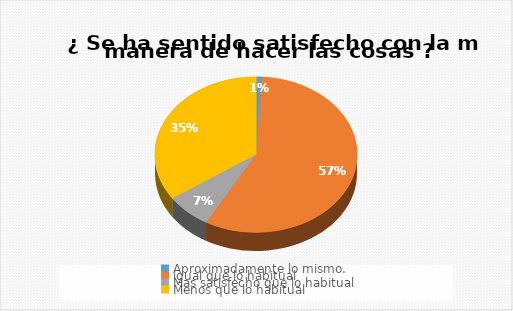
| Category |  ¿ Se ha sentido satisfecho con la manera de hacer las cosas ? |
|---|---|
| Aproximadamente lo mismo. | 1 |
| igual que lo habitual | 63 |
| Mas satisfecho que lo habitual | 8 |
| Menos que lo habitual | 38 |